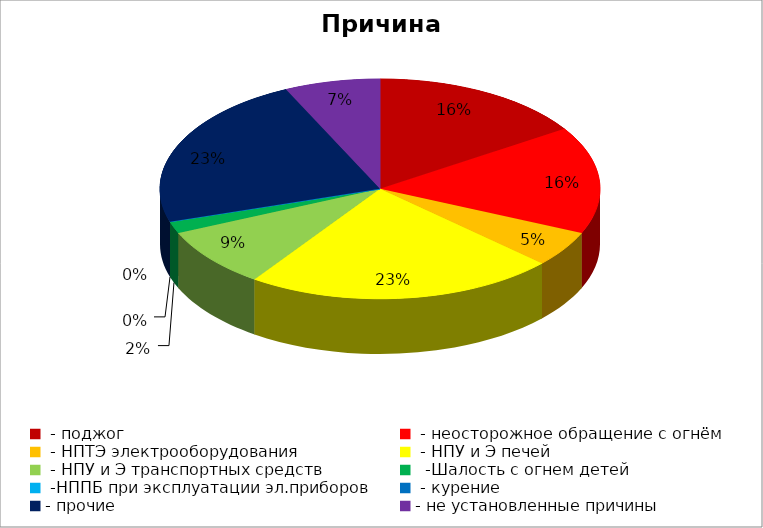
| Category | Причина пожара |
|---|---|
|  - поджог | 9 |
|  - неосторожное обращение с огнём | 9 |
|  - НПТЭ электрооборудования | 3 |
|  - НПУ и Э печей | 13 |
|  - НПУ и Э транспортных средств | 5 |
|   -Шалость с огнем детей | 1 |
|  -НППБ при эксплуатации эл.приборов | 0 |
|  - курение | 0 |
| - прочие | 13 |
| - не установленные причины | 4 |